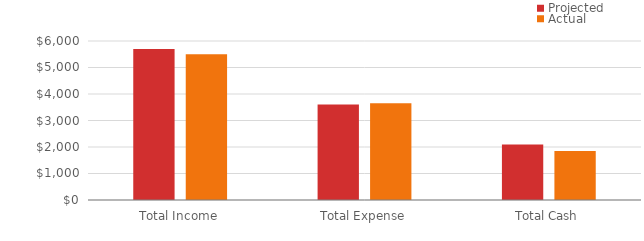
| Category | Projected | Actual |
|---|---|---|
| 0 | 5700 | 5500 |
| 1 | 3603 | 3655 |
| 2 | 2097 | 1845 |